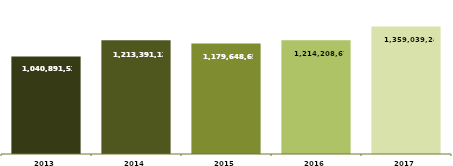
| Category | VALOR ARRECADADO (1,00) |
|---|---|
| 2013.0 | 1040891533 |
| 2014.0 | 1213391121 |
| 2015.0 | 1179648654 |
| 2016.0 | 1214208671 |
| 2017.0 | 1359039244 |